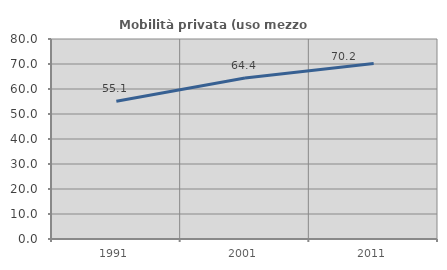
| Category | Mobilità privata (uso mezzo privato) |
|---|---|
| 1991.0 | 55.107 |
| 2001.0 | 64.395 |
| 2011.0 | 70.181 |